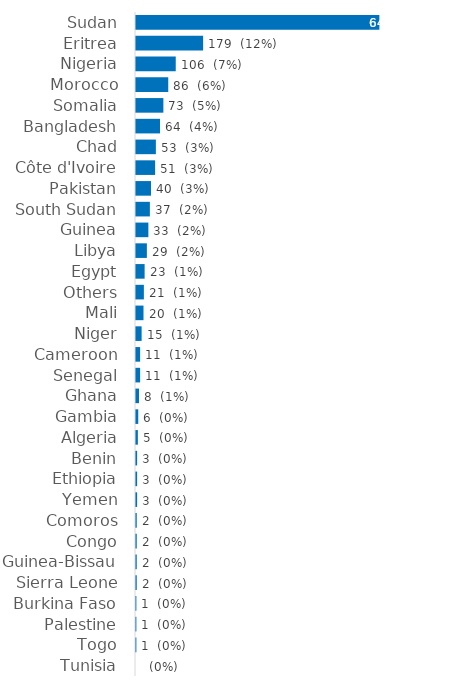
| Category | Sudan |
|---|---|
| Sudan | 649 |
| Eritrea | 179 |
| Nigeria | 106 |
| Morocco | 86 |
| Somalia | 73 |
| Bangladesh | 64 |
| Chad | 53 |
| Côte d'Ivoire | 51 |
| Pakistan | 40 |
| South Sudan | 37 |
| Guinea | 33 |
| Libya | 29 |
| Egypt | 23 |
| Others | 21 |
| Mali | 20 |
| Niger | 15 |
| Cameroon | 11 |
| Senegal | 11 |
| Ghana | 8 |
| Gambia | 6 |
| Algeria | 5 |
| Benin | 3 |
| Ethiopia | 3 |
| Yemen | 3 |
| Comoros | 2 |
| Congo | 2 |
| Guinea-Bissau | 2 |
| Sierra Leone | 2 |
| Burkina Faso | 1 |
| Palestine | 1 |
| Togo | 1 |
| Tunisia | 0 |